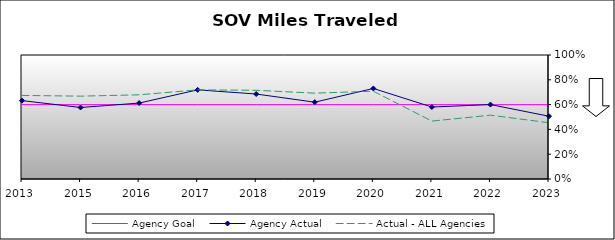
| Category | Agency Goal | Agency Actual | Actual - ALL Agencies |
|---|---|---|---|
| 2013.0 | 0.6 | 0.632 | 0.674 |
| 2015.0 | 0.6 | 0.577 | 0.668 |
| 2016.0 | 0.6 | 0.612 | 0.679 |
| 2017.0 | 0.6 | 0.719 | 0.719 |
| 2018.0 | 0.6 | 0.685 | 0.715 |
| 2019.0 | 0.6 | 0.619 | 0.692 |
| 2020.0 | 0.6 | 0.73 | 0.708 |
| 2021.0 | 0.6 | 0.58 | 0.467 |
| 2022.0 | 0.6 | 0.6 | 0.515 |
| 2023.0 | 0.6 | 0.506 | 0.454 |